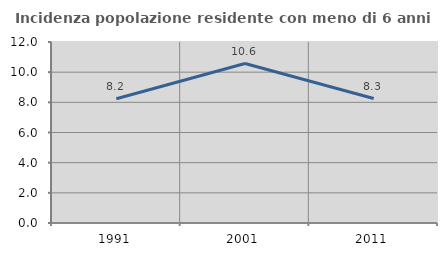
| Category | Incidenza popolazione residente con meno di 6 anni |
|---|---|
| 1991.0 | 8.237 |
| 2001.0 | 10.574 |
| 2011.0 | 8.252 |